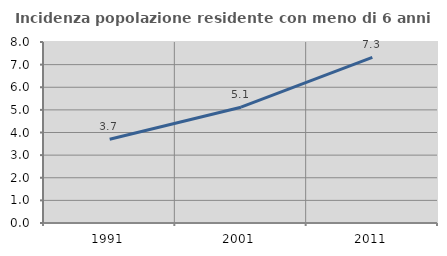
| Category | Incidenza popolazione residente con meno di 6 anni |
|---|---|
| 1991.0 | 3.701 |
| 2001.0 | 5.12 |
| 2011.0 | 7.317 |